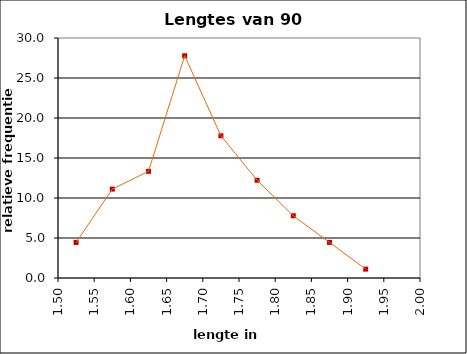
| Category | Series 0 |
|---|---|
| 1.525 | 4.444 |
| 1.575 | 11.111 |
| 1.625 | 13.333 |
| 1.675 | 27.778 |
| 1.725 | 17.778 |
| 1.775 | 12.222 |
| 1.825 | 7.778 |
| 1.875 | 4.444 |
| 1.925 | 1.111 |